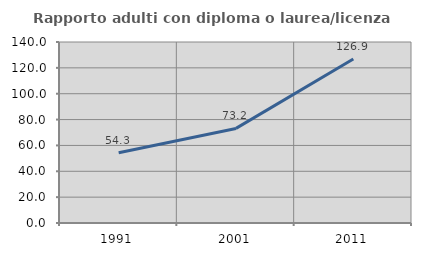
| Category | Rapporto adulti con diploma o laurea/licenza media  |
|---|---|
| 1991.0 | 54.28 |
| 2001.0 | 73.16 |
| 2011.0 | 126.852 |